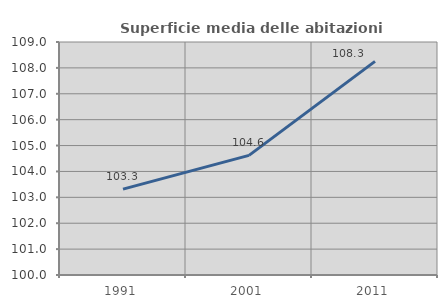
| Category | Superficie media delle abitazioni occupate |
|---|---|
| 1991.0 | 103.316 |
| 2001.0 | 104.622 |
| 2011.0 | 108.253 |